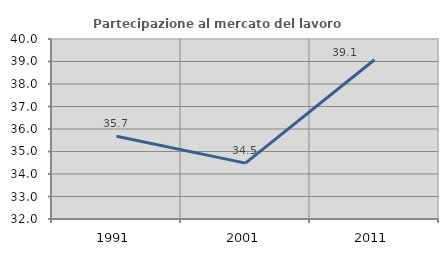
| Category | Partecipazione al mercato del lavoro  femminile |
|---|---|
| 1991.0 | 35.678 |
| 2001.0 | 34.483 |
| 2011.0 | 39.079 |